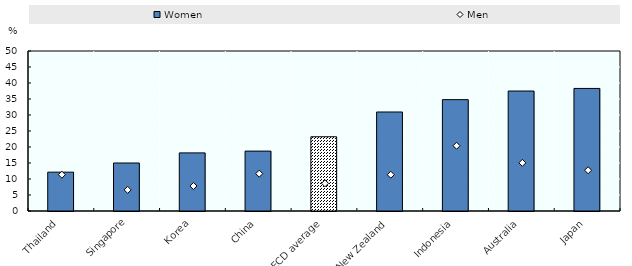
| Category | Women |
|---|---|
| Thailand | 12.137 |
| Singapore | 15 |
| Korea | 18.163 |
| China | 18.72 |
| OECD average | 23.205 |
| New Zealand | 30.941 |
| Indonesia | 34.8 |
| Australia | 37.492 |
| Japan | 38.301 |